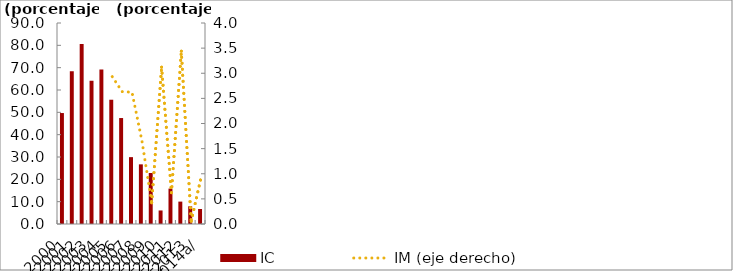
| Category | IC |
|---|---|
| 2000 | 49.683 |
| 2001 | 68.431 |
| 2002 | 80.616 |
| 2003 | 64.128 |
| 2004 | 69.175 |
| 2005 | 55.644 |
| 2006 | 47.446 |
| 2007 | 29.941 |
| 2008 | 26.709 |
| 2009 | 22.829 |
| 2010 | 6.058 |
| 2011 | 15.853 |
| 2012 | 10.027 |
| 2013 | 7.933 |
| 2014a/ | 6.715 |